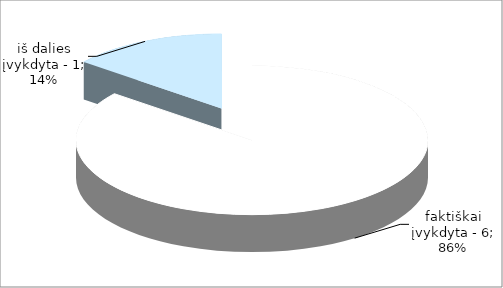
| Category | Series 0 |
|---|---|
| 0 | 6 |
| 1 | 1 |